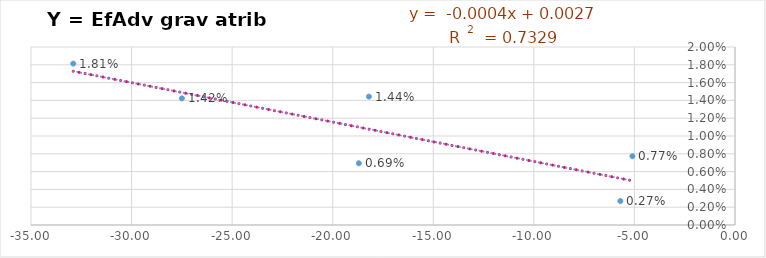
| Category | Y = EfAdv grav atrib /año |
|---|---|
| -18.69999999999999 | 0.007 |
| -32.900000000000006 | 0.018 |
| -18.19999999999999 | 0.014 |
| -5.699999999999989 | 0.003 |
| -27.5 | 0.014 |
| -5.099999999999994 | 0.008 |